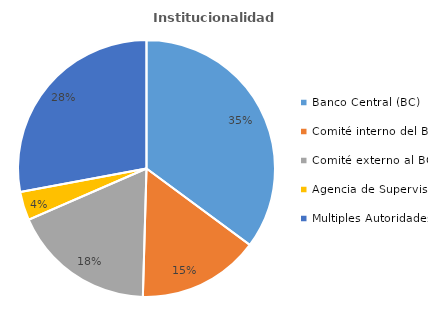
| Category | Series 0 |
|---|---|
| Banco Central (BC) | 39 |
| Comité interno del BC | 17 |
| Comité externo al BC | 20 |
| Agencia de Supervisión | 4 |
| Multiples Autoridades | 31 |